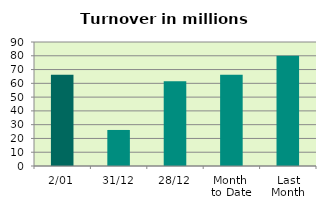
| Category | Series 0 |
|---|---|
| 2/01 | 66.285 |
| 31/12 | 26.153 |
| 28/12 | 61.455 |
| Month 
to Date | 66.285 |
| Last
Month | 79.992 |